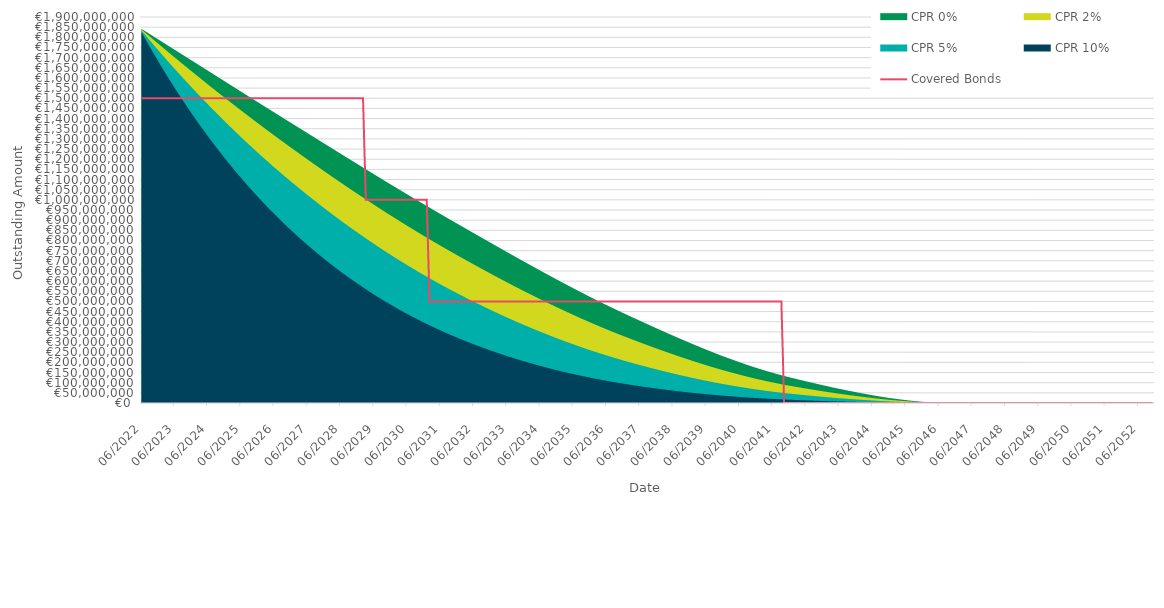
| Category | Covered Bonds |
|---|---|
| 2022-06-30 | 1500000000 |
| 2022-07-31 | 1500000000 |
| 2022-08-31 | 1500000000 |
| 2022-09-30 | 1500000000 |
| 2022-10-31 | 1500000000 |
| 2022-11-30 | 1500000000 |
| 2022-12-31 | 1500000000 |
| 2023-01-31 | 1500000000 |
| 2023-02-28 | 1500000000 |
| 2023-03-31 | 1500000000 |
| 2023-04-30 | 1500000000 |
| 2023-05-31 | 1500000000 |
| 2023-06-30 | 1500000000 |
| 2023-07-31 | 1500000000 |
| 2023-08-31 | 1500000000 |
| 2023-09-30 | 1500000000 |
| 2023-10-31 | 1500000000 |
| 2023-11-30 | 1500000000 |
| 2023-12-31 | 1500000000 |
| 2024-01-31 | 1500000000 |
| 2024-02-29 | 1500000000 |
| 2024-03-31 | 1500000000 |
| 2024-04-30 | 1500000000 |
| 2024-05-31 | 1500000000 |
| 2024-06-30 | 1500000000 |
| 2024-07-31 | 1500000000 |
| 2024-08-31 | 1500000000 |
| 2024-09-30 | 1500000000 |
| 2024-10-31 | 1500000000 |
| 2024-11-30 | 1500000000 |
| 2024-12-31 | 1500000000 |
| 2025-01-31 | 1500000000 |
| 2025-02-28 | 1500000000 |
| 2025-03-31 | 1500000000 |
| 2025-04-30 | 1500000000 |
| 2025-05-31 | 1500000000 |
| 2025-06-30 | 1500000000 |
| 2025-07-31 | 1500000000 |
| 2025-08-31 | 1500000000 |
| 2025-09-30 | 1500000000 |
| 2025-10-31 | 1500000000 |
| 2025-11-30 | 1500000000 |
| 2025-12-31 | 1500000000 |
| 2026-01-31 | 1500000000 |
| 2026-02-28 | 1500000000 |
| 2026-03-31 | 1500000000 |
| 2026-04-30 | 1500000000 |
| 2026-05-31 | 1500000000 |
| 2026-06-30 | 1500000000 |
| 2026-07-31 | 1500000000 |
| 2026-08-31 | 1500000000 |
| 2026-09-30 | 1500000000 |
| 2026-10-31 | 1500000000 |
| 2026-11-30 | 1500000000 |
| 2026-12-31 | 1500000000 |
| 2027-01-31 | 1500000000 |
| 2027-02-28 | 1500000000 |
| 2027-03-31 | 1500000000 |
| 2027-04-30 | 1500000000 |
| 2027-05-31 | 1500000000 |
| 2027-06-30 | 1500000000 |
| 2027-07-31 | 1500000000 |
| 2027-08-31 | 1500000000 |
| 2027-09-30 | 1500000000 |
| 2027-10-31 | 1500000000 |
| 2027-11-30 | 1500000000 |
| 2027-12-31 | 1500000000 |
| 2028-01-31 | 1500000000 |
| 2028-02-29 | 1500000000 |
| 2028-03-31 | 1500000000 |
| 2028-04-30 | 1500000000 |
| 2028-05-31 | 1500000000 |
| 2028-06-30 | 1500000000 |
| 2028-07-31 | 1500000000 |
| 2028-08-31 | 1500000000 |
| 2028-09-30 | 1500000000 |
| 2028-10-31 | 1500000000 |
| 2028-11-30 | 1500000000 |
| 2028-12-31 | 1500000000 |
| 2029-01-31 | 1500000000 |
| 2029-02-28 | 1500000000 |
| 2029-03-31 | 1000000000 |
| 2029-04-30 | 1000000000 |
| 2029-05-31 | 1000000000 |
| 2029-06-30 | 1000000000 |
| 2029-07-31 | 1000000000 |
| 2029-08-31 | 1000000000 |
| 2029-09-30 | 1000000000 |
| 2029-10-31 | 1000000000 |
| 2029-11-30 | 1000000000 |
| 2029-12-31 | 1000000000 |
| 2030-01-31 | 1000000000 |
| 2030-02-28 | 1000000000 |
| 2030-03-31 | 1000000000 |
| 2030-04-30 | 1000000000 |
| 2030-05-31 | 1000000000 |
| 2030-06-30 | 1000000000 |
| 2030-07-31 | 1000000000 |
| 2030-08-31 | 1000000000 |
| 2030-09-30 | 1000000000 |
| 2030-10-31 | 1000000000 |
| 2030-11-30 | 1000000000 |
| 2030-12-31 | 1000000000 |
| 2031-01-31 | 1000000000 |
| 2031-02-28 | 500000000 |
| 2031-03-31 | 500000000 |
| 2031-04-30 | 500000000 |
| 2031-05-31 | 500000000 |
| 2031-06-30 | 500000000 |
| 2031-07-31 | 500000000 |
| 2031-08-31 | 500000000 |
| 2031-09-30 | 500000000 |
| 2031-10-31 | 500000000 |
| 2031-11-30 | 500000000 |
| 2031-12-31 | 500000000 |
| 2032-01-31 | 500000000 |
| 2032-02-29 | 500000000 |
| 2032-03-31 | 500000000 |
| 2032-04-30 | 500000000 |
| 2032-05-31 | 500000000 |
| 2032-06-30 | 500000000 |
| 2032-07-31 | 500000000 |
| 2032-08-31 | 500000000 |
| 2032-09-30 | 500000000 |
| 2032-10-31 | 500000000 |
| 2032-11-30 | 500000000 |
| 2032-12-31 | 500000000 |
| 2033-01-31 | 500000000 |
| 2033-02-28 | 500000000 |
| 2033-03-31 | 500000000 |
| 2033-04-30 | 500000000 |
| 2033-05-31 | 500000000 |
| 2033-06-30 | 500000000 |
| 2033-07-31 | 500000000 |
| 2033-08-31 | 500000000 |
| 2033-09-30 | 500000000 |
| 2033-10-31 | 500000000 |
| 2033-11-30 | 500000000 |
| 2033-12-31 | 500000000 |
| 2034-01-31 | 500000000 |
| 2034-02-28 | 500000000 |
| 2034-03-31 | 500000000 |
| 2034-04-30 | 500000000 |
| 2034-05-31 | 500000000 |
| 2034-06-30 | 500000000 |
| 2034-07-31 | 500000000 |
| 2034-08-31 | 500000000 |
| 2034-09-30 | 500000000 |
| 2034-10-31 | 500000000 |
| 2034-11-30 | 500000000 |
| 2034-12-31 | 500000000 |
| 2035-01-31 | 500000000 |
| 2035-02-28 | 500000000 |
| 2035-03-31 | 500000000 |
| 2035-04-30 | 500000000 |
| 2035-05-31 | 500000000 |
| 2035-06-30 | 500000000 |
| 2035-07-31 | 500000000 |
| 2035-08-31 | 500000000 |
| 2035-09-30 | 500000000 |
| 2035-10-31 | 500000000 |
| 2035-11-30 | 500000000 |
| 2035-12-31 | 500000000 |
| 2036-01-31 | 500000000 |
| 2036-02-29 | 500000000 |
| 2036-03-31 | 500000000 |
| 2036-04-30 | 500000000 |
| 2036-05-31 | 500000000 |
| 2036-06-30 | 500000000 |
| 2036-07-31 | 500000000 |
| 2036-08-31 | 500000000 |
| 2036-09-30 | 500000000 |
| 2036-10-31 | 500000000 |
| 2036-11-30 | 500000000 |
| 2036-12-31 | 500000000 |
| 2037-01-31 | 500000000 |
| 2037-02-28 | 500000000 |
| 2037-03-31 | 500000000 |
| 2037-04-30 | 500000000 |
| 2037-05-31 | 500000000 |
| 2037-06-30 | 500000000 |
| 2037-07-31 | 500000000 |
| 2037-08-31 | 500000000 |
| 2037-09-30 | 500000000 |
| 2037-10-31 | 500000000 |
| 2037-11-30 | 500000000 |
| 2037-12-31 | 500000000 |
| 2038-01-31 | 500000000 |
| 2038-02-28 | 500000000 |
| 2038-03-31 | 500000000 |
| 2038-04-30 | 500000000 |
| 2038-05-31 | 500000000 |
| 2038-06-30 | 500000000 |
| 2038-07-31 | 500000000 |
| 2038-08-31 | 500000000 |
| 2038-09-30 | 500000000 |
| 2038-10-31 | 500000000 |
| 2038-11-30 | 500000000 |
| 2038-12-31 | 500000000 |
| 2039-01-31 | 500000000 |
| 2039-02-28 | 500000000 |
| 2039-03-31 | 500000000 |
| 2039-04-30 | 500000000 |
| 2039-05-31 | 500000000 |
| 2039-06-30 | 500000000 |
| 2039-07-31 | 500000000 |
| 2039-08-31 | 500000000 |
| 2039-09-30 | 500000000 |
| 2039-10-31 | 500000000 |
| 2039-11-30 | 500000000 |
| 2039-12-31 | 500000000 |
| 2040-01-31 | 500000000 |
| 2040-02-29 | 500000000 |
| 2040-03-31 | 500000000 |
| 2040-04-30 | 500000000 |
| 2040-05-31 | 500000000 |
| 2040-06-30 | 500000000 |
| 2040-07-31 | 500000000 |
| 2040-08-31 | 500000000 |
| 2040-09-30 | 500000000 |
| 2040-10-31 | 500000000 |
| 2040-11-30 | 500000000 |
| 2040-12-31 | 500000000 |
| 2041-01-31 | 500000000 |
| 2041-02-28 | 500000000 |
| 2041-03-31 | 500000000 |
| 2041-04-30 | 500000000 |
| 2041-05-31 | 500000000 |
| 2041-06-30 | 500000000 |
| 2041-07-31 | 500000000 |
| 2041-08-31 | 500000000 |
| 2041-09-30 | 500000000 |
| 2041-10-31 | 0 |
| 2041-11-30 | 0 |
| 2041-12-31 | 0 |
| 2042-01-31 | 0 |
| 2042-02-28 | 0 |
| 2042-03-31 | 0 |
| 2042-04-30 | 0 |
| 2042-05-31 | 0 |
| 2042-06-30 | 0 |
| 2042-07-31 | 0 |
| 2042-08-31 | 0 |
| 2042-09-30 | 0 |
| 2042-10-31 | 0 |
| 2042-11-30 | 0 |
| 2042-12-31 | 0 |
| 2043-01-31 | 0 |
| 2043-02-28 | 0 |
| 2043-03-31 | 0 |
| 2043-04-30 | 0 |
| 2043-05-31 | 0 |
| 2043-06-30 | 0 |
| 2043-07-31 | 0 |
| 2043-08-31 | 0 |
| 2043-09-30 | 0 |
| 2043-10-31 | 0 |
| 2043-11-30 | 0 |
| 2043-12-31 | 0 |
| 2044-01-31 | 0 |
| 2044-02-29 | 0 |
| 2044-03-31 | 0 |
| 2044-04-30 | 0 |
| 2044-05-31 | 0 |
| 2044-06-30 | 0 |
| 2044-07-31 | 0 |
| 2044-08-31 | 0 |
| 2044-09-30 | 0 |
| 2044-10-31 | 0 |
| 2044-11-30 | 0 |
| 2044-12-31 | 0 |
| 2045-01-31 | 0 |
| 2045-02-28 | 0 |
| 2045-03-31 | 0 |
| 2045-04-30 | 0 |
| 2045-05-31 | 0 |
| 2045-06-30 | 0 |
| 2045-07-31 | 0 |
| 2045-08-31 | 0 |
| 2045-09-30 | 0 |
| 2045-10-31 | 0 |
| 2045-11-30 | 0 |
| 2045-12-31 | 0 |
| 2046-01-31 | 0 |
| 2046-02-28 | 0 |
| 2046-03-31 | 0 |
| 2046-04-30 | 0 |
| 2046-05-31 | 0 |
| 2046-06-30 | 0 |
| 2046-07-31 | 0 |
| 2046-08-31 | 0 |
| 2046-09-30 | 0 |
| 2046-10-31 | 0 |
| 2046-11-30 | 0 |
| 2046-12-31 | 0 |
| 2047-01-31 | 0 |
| 2047-02-28 | 0 |
| 2047-03-31 | 0 |
| 2047-04-30 | 0 |
| 2047-05-31 | 0 |
| 2047-06-30 | 0 |
| 2047-07-31 | 0 |
| 2047-08-31 | 0 |
| 2047-09-30 | 0 |
| 2047-10-31 | 0 |
| 2047-11-30 | 0 |
| 2047-12-31 | 0 |
| 2048-01-31 | 0 |
| 2048-02-29 | 0 |
| 2048-03-31 | 0 |
| 2048-04-30 | 0 |
| 2048-05-31 | 0 |
| 2048-06-30 | 0 |
| 2048-07-31 | 0 |
| 2048-08-31 | 0 |
| 2048-09-30 | 0 |
| 2048-10-31 | 0 |
| 2048-11-30 | 0 |
| 2048-12-31 | 0 |
| 2049-01-31 | 0 |
| 2049-02-28 | 0 |
| 2049-03-31 | 0 |
| 2049-04-30 | 0 |
| 2049-05-31 | 0 |
| 2049-06-30 | 0 |
| 2049-07-31 | 0 |
| 2049-08-31 | 0 |
| 2049-09-30 | 0 |
| 2049-10-31 | 0 |
| 2049-11-30 | 0 |
| 2049-12-31 | 0 |
| 2050-01-31 | 0 |
| 2050-02-28 | 0 |
| 2050-03-31 | 0 |
| 2050-04-30 | 0 |
| 2050-05-31 | 0 |
| 2050-06-30 | 0 |
| 2050-07-31 | 0 |
| 2050-08-31 | 0 |
| 2050-09-30 | 0 |
| 2050-10-31 | 0 |
| 2050-11-30 | 0 |
| 2050-12-31 | 0 |
| 2051-01-31 | 0 |
| 2051-02-28 | 0 |
| 2051-03-31 | 0 |
| 2051-04-30 | 0 |
| 2051-05-31 | 0 |
| 2051-06-30 | 0 |
| 2051-07-31 | 0 |
| 2051-08-31 | 0 |
| 2051-09-30 | 0 |
| 2051-10-31 | 0 |
| 2051-11-30 | 0 |
| 2051-12-31 | 0 |
| 2052-01-31 | 0 |
| 2052-02-29 | 0 |
| 2052-03-31 | 0 |
| 2052-04-30 | 0 |
| 2052-05-31 | 0 |
| 2052-06-30 | 0 |
| 2052-07-31 | 0 |
| 2052-08-31 | 0 |
| 2052-09-30 | 0 |
| 2052-10-31 | 0 |
| 2052-11-30 | 0 |